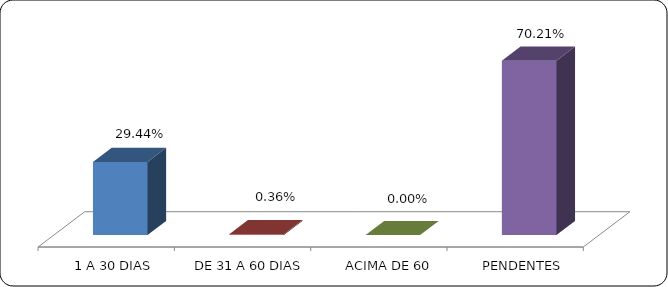
| Category | Series 0 |
|---|---|
|      1 A 30 DIAS | 0.294 |
|      DE 31 A 60 DIAS | 0.004 |
|      ACIMA DE 60 DIAS | 0 |
|      PENDENTES | 0.702 |